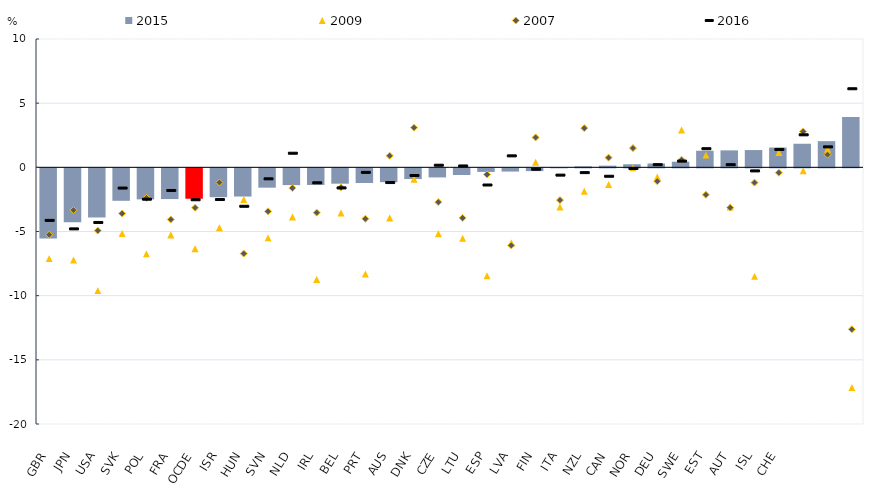
| Category | 2015 |
|---|---|
| GBR | -5.461 |
| JPN | -4.202 |
| USA | -3.829 |
| SVK | -2.53 |
| POL | -2.419 |
| FRA | -2.395 |
| OCDE | -2.369 |
| ISR | -2.249 |
| HUN | -2.198 |
| SVN | -1.506 |
| NLD | -1.307 |
| IRL | -1.294 |
| BEL | -1.195 |
| PRT | -1.143 |
| AUS | -1.077 |
| DNK | -0.836 |
| CZE | -0.708 |
| LTU | -0.518 |
| ESP | -0.279 |
| LVA | -0.252 |
| FIN | -0.216 |
| ITA | 0.003 |
| NZL | 0.08 |
| CAN | 0.129 |
| NOR | 0.241 |
| DEU | 0.299 |
| SWE | 0.438 |
| EST | 1.293 |
| AUT | 1.322 |
| ISL | 1.345 |
| CHE | 1.542 |